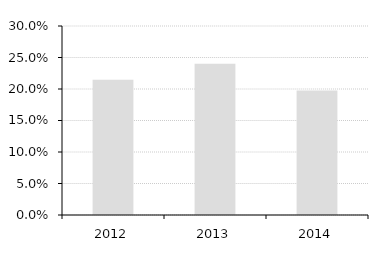
| Category | Return on Equity |
|---|---|
| 2012.0 | 0.215 |
| 2013.0 | 0.24 |
| 2014.0 | 0.198 |